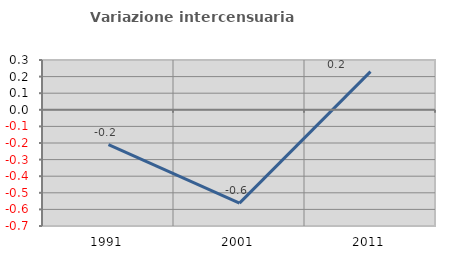
| Category | Variazione intercensuaria annua |
|---|---|
| 1991.0 | -0.21 |
| 2001.0 | -0.562 |
| 2011.0 | 0.23 |